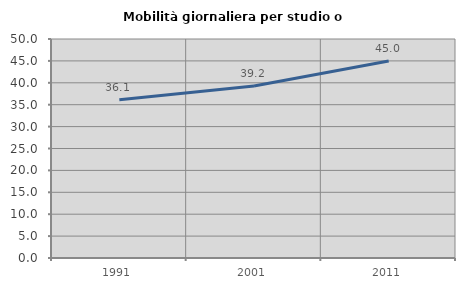
| Category | Mobilità giornaliera per studio o lavoro |
|---|---|
| 1991.0 | 36.141 |
| 2001.0 | 39.249 |
| 2011.0 | 44.98 |